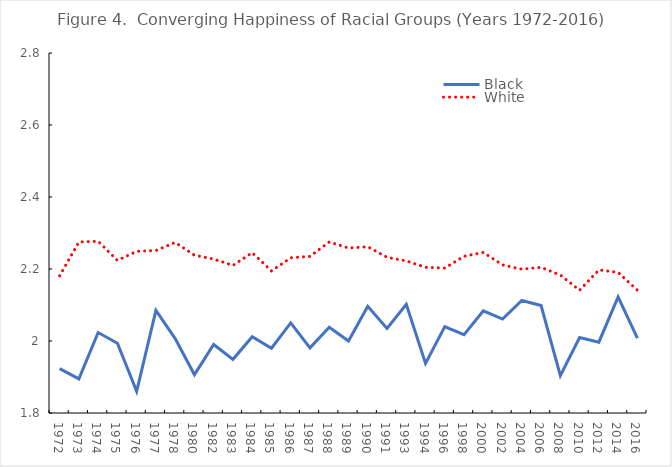
| Category | Black | White |
|---|---|---|
| 1972.0 | 1.923 | 2.181 |
| 1973.0 | 1.895 | 2.275 |
| 1974.0 | 2.024 | 2.277 |
| 1975.0 | 1.994 | 2.224 |
| 1976.0 | 1.86 | 2.249 |
| 1977.0 | 2.085 | 2.251 |
| 1978.0 | 2.007 | 2.274 |
| 1980.0 | 1.906 | 2.238 |
| 1982.0 | 1.99 | 2.228 |
| 1983.0 | 1.949 | 2.21 |
| 1984.0 | 2.012 | 2.245 |
| 1985.0 | 1.98 | 2.195 |
| 1986.0 | 2.05 | 2.231 |
| 1987.0 | 1.981 | 2.235 |
| 1988.0 | 2.038 | 2.275 |
| 1989.0 | 2 | 2.258 |
| 1990.0 | 2.096 | 2.262 |
| 1991.0 | 2.035 | 2.232 |
| 1993.0 | 2.102 | 2.222 |
| 1994.0 | 1.938 | 2.205 |
| 1996.0 | 2.04 | 2.202 |
| 1998.0 | 2.018 | 2.235 |
| 2000.0 | 2.084 | 2.246 |
| 2002.0 | 2.061 | 2.211 |
| 2004.0 | 2.112 | 2.199 |
| 2006.0 | 2.099 | 2.205 |
| 2008.0 | 1.904 | 2.183 |
| 2010.0 | 2.01 | 2.141 |
| 2012.0 | 1.997 | 2.197 |
| 2014.0 | 2.122 | 2.19 |
| 2016.0 | 2.008 | 2.141 |